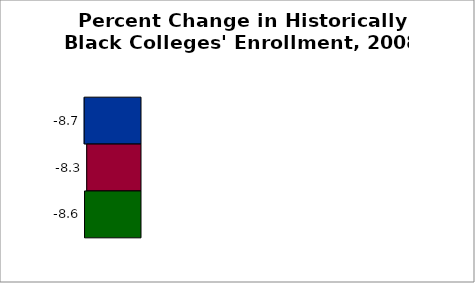
| Category | 50 states and D.C. | SREB states | State |
|---|---|---|---|
| 2009 to 2014 | -8.666 | -8.273 | -8.608 |